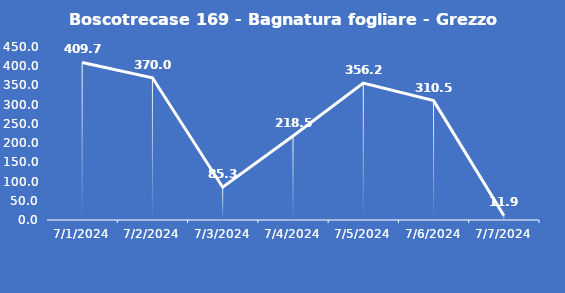
| Category | Boscotrecase 169 - Bagnatura fogliare - Grezzo (min) |
|---|---|
| 7/1/24 | 409.7 |
| 7/2/24 | 370 |
| 7/3/24 | 85.3 |
| 7/4/24 | 218.5 |
| 7/5/24 | 356.2 |
| 7/6/24 | 310.5 |
| 7/7/24 | 11.9 |